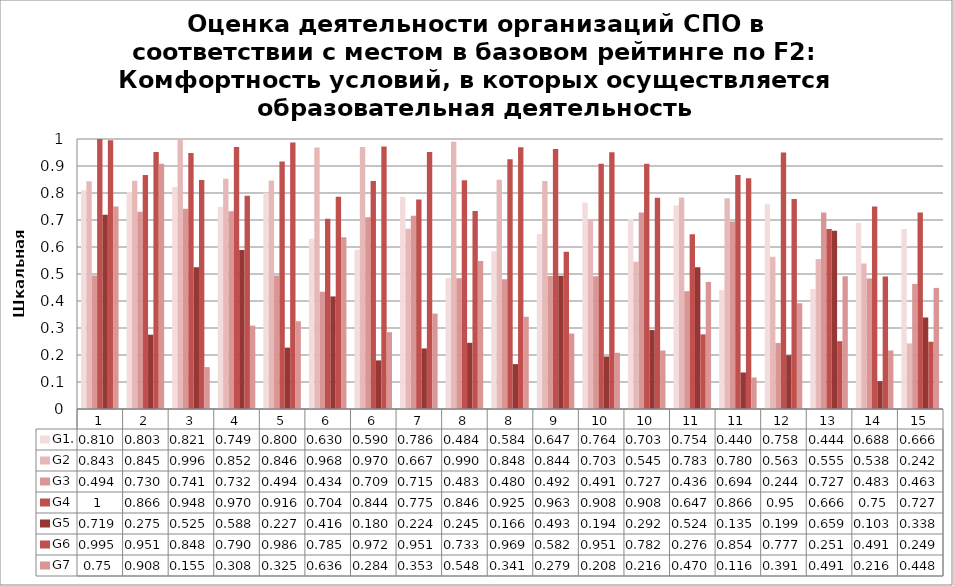
| Category | G1. | G2 | G3 | G4 | G5 | G6 | G7 |
|---|---|---|---|---|---|---|---|
| 1.0 | 0.81 | 0.844 | 0.494 | 1 | 0.72 | 0.996 | 0.75 |
| 2.0 | 0.804 | 0.845 | 0.731 | 0.867 | 0.275 | 0.951 | 0.908 |
| 3.0 | 0.822 | 0.996 | 0.741 | 0.948 | 0.525 | 0.848 | 0.155 |
| 4.0 | 0.749 | 0.853 | 0.733 | 0.971 | 0.589 | 0.79 | 0.309 |
| 5.0 | 0.801 | 0.846 | 0.494 | 0.917 | 0.227 | 0.987 | 0.325 |
| 6.0 | 0.63 | 0.969 | 0.434 | 0.705 | 0.417 | 0.786 | 0.636 |
| 6.0 | 0.59 | 0.97 | 0.71 | 0.845 | 0.18 | 0.972 | 0.284 |
| 7.0 | 0.786 | 0.667 | 0.716 | 0.776 | 0.224 | 0.952 | 0.353 |
| 8.0 | 0.485 | 0.99 | 0.484 | 0.847 | 0.245 | 0.733 | 0.548 |
| 8.0 | 0.584 | 0.849 | 0.481 | 0.925 | 0.166 | 0.969 | 0.342 |
| 9.0 | 0.648 | 0.844 | 0.493 | 0.963 | 0.493 | 0.582 | 0.279 |
| 10.0 | 0.765 | 0.704 | 0.492 | 0.908 | 0.194 | 0.951 | 0.208 |
| 10.0 | 0.704 | 0.545 | 0.728 | 0.908 | 0.292 | 0.782 | 0.217 |
| 11.0 | 0.754 | 0.783 | 0.436 | 0.647 | 0.525 | 0.276 | 0.471 |
| 11.0 | 0.441 | 0.781 | 0.694 | 0.867 | 0.135 | 0.855 | 0.117 |
| 12.0 | 0.758 | 0.563 | 0.244 | 0.95 | 0.199 | 0.778 | 0.392 |
| 13.0 | 0.444 | 0.556 | 0.728 | 0.667 | 0.66 | 0.251 | 0.492 |
| 14.0 | 0.689 | 0.539 | 0.483 | 0.75 | 0.103 | 0.491 | 0.217 |
| 15.0 | 0.667 | 0.243 | 0.463 | 0.728 | 0.339 | 0.249 | 0.449 |